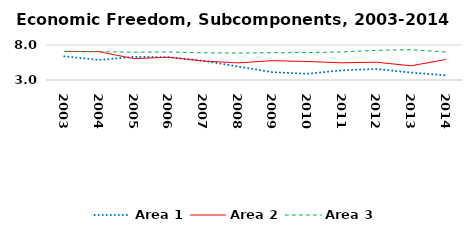
| Category | Area 1 | Area 2 | Area 3 |
|---|---|---|---|
| 2003.0 | 6.38 | 7.097 | 7.066 |
| 2004.0 | 5.863 | 7.046 | 7.058 |
| 2005.0 | 6.306 | 6.05 | 6.967 |
| 2006.0 | 6.262 | 6.256 | 7.002 |
| 2007.0 | 5.754 | 5.714 | 6.886 |
| 2008.0 | 4.933 | 5.445 | 6.856 |
| 2009.0 | 4.118 | 5.762 | 6.895 |
| 2010.0 | 3.885 | 5.643 | 6.92 |
| 2011.0 | 4.381 | 5.46 | 7.011 |
| 2012.0 | 4.583 | 5.542 | 7.245 |
| 2013.0 | 4.063 | 5.031 | 7.33 |
| 2014.0 | 3.667 | 5.927 | 7.006 |